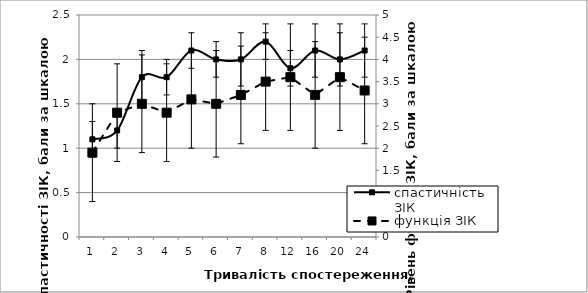
| Category | спастичність ЗІК |
|---|---|
| 1.0 | 1.1 |
| 2.0 | 1.2 |
| 3.0 | 1.8 |
| 4.0 | 1.8 |
| 5.0 | 2.1 |
| 6.0 | 2 |
| 7.0 | 2 |
| 8.0 | 2.2 |
| 12.0 | 1.9 |
| 16.0 | 2.1 |
| 20.0 | 2 |
| 24.0 | 2.1 |